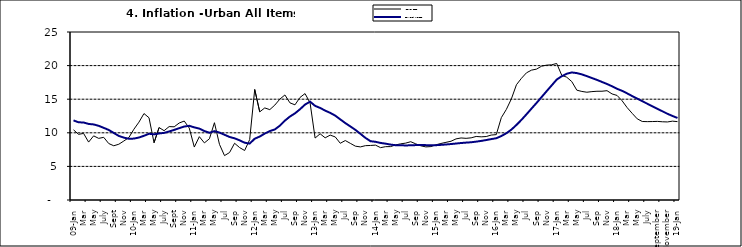
| Category | Year-on Rate | 12-Month Average |
|---|---|---|
| 09-Jan | 10.439 | 11.844 |
| Feb | 9.772 | 11.562 |
| Mar | 9.907 | 11.538 |
| Apr | 8.618 | 11.319 |
| May | 9.547 | 11.246 |
| June | 9.17 | 11.039 |
| July | 9.325 | 10.738 |
| Aug | 8.401 | 10.424 |
| Sept | 8.07 | 9.973 |
| Oct | 8.3 | 9.535 |
| Nov | 8.781 | 9.278 |
| Dec | 9.298 | 9.117 |
| 10-Jan | 10.534 | 9.136 |
| Feb | 11.584 | 9.297 |
| Mar | 12.864 | 9.555 |
| Apr | 12.24 | 9.859 |
| May | 8.524 | 9.769 |
| June | 10.781 | 9.904 |
| July | 10.313 | 9.987 |
| Aug | 10.924 | 10.197 |
| Sept | 10.891 | 10.43 |
| Oct | 11.457 | 10.689 |
| Nov | 11.748 | 10.932 |
| Dec | 10.699 | 11.042 |
| 11-Jan | 7.878 | 10.806 |
| Feb | 9.426 | 10.623 |
| Mar | 8.498 | 10.26 |
| Apr | 9.11 | 10.005 |
| May | 11.5 | 10.249 |
| Jun | 8.278 | 10.034 |
| Jul | 6.608 | 9.711 |
| Aug | 7.061 | 9.38 |
| Sep | 8.443 | 9.178 |
| Oct | 7.802 | 8.88 |
| Nov | 7.365 | 8.525 |
| Dec | 8.993 | 8.395 |
| 12-Jan | 16.445 | 9.119 |
| Feb | 13.123 | 9.443 |
| Mar | 13.701 | 9.889 |
| Apr | 13.447 | 10.259 |
| May | 14.127 | 10.496 |
| Jun | 15.012 | 11.062 |
| Jul | 15.63 | 11.81 |
| Aug | 14.456 | 12.422 |
| Sep | 14.162 | 12.893 |
| Oct | 15.26 | 13.506 |
| Nov | 15.836 | 14.199 |
| Dec | 14.459 | 14.637 |
| 13-Jan | 9.22 | 14.006 |
| Feb | 9.85 | 13.703 |
| Mar | 9.253 | 13.302 |
| Apr | 9.657 | 12.966 |
| May | 9.385 | 12.557 |
| Jun | 8.441 | 11.999 |
| Jul | 8.849 | 11.443 |
| Aug | 8.431 | 10.946 |
| Sep | 8.013 | 10.44 |
| Oct | 7.9 | 9.849 |
| Nov | 8.086 | 9.245 |
| Dec | 8.117 | 8.75 |
| 14-Jan | 8.164 | 8.662 |
| Feb | 7.791 | 8.493 |
| Mar | 7.937 | 8.384 |
| Apr | 7.947 | 8.246 |
| May | 8.195 | 8.151 |
| Jun | 8.358 | 8.146 |
| Jul | 8.464 | 8.118 |
| Aug | 8.673 | 8.141 |
| Sep | 8.357 | 8.17 |
| Oct | 8.064 | 8.182 |
| Nov | 7.902 | 8.165 |
| Dec | 7.948 | 8.151 |
| 15-Jan | 8.211 | 8.155 |
| Feb | 8.412 | 8.206 |
| Mar | 8.579 | 8.26 |
| Apr | 8.742 | 8.326 |
| May | 9.092 | 8.403 |
| Jun | 9.232 | 8.478 |
| Jul | 9.177 | 8.54 |
| Aug | 9.25 | 8.591 |
| Sep | 9.455 | 8.684 |
| Oct | 9.398 | 8.795 |
| Nov | 9.442 | 8.922 |
| Dec | 9.665 | 9.064 |
| 16-Jan | 9.728 | 9.19 |
| Feb | 12.254 | 9.516 |
| Mar | 13.485 | 9.935 |
| Apr | 15.052 | 10.474 |
| May | 17.148 | 11.165 |
| Jun | 18.111 | 11.925 |
| Jul | 18.927 | 12.754 |
| Aug | 19.325 | 13.605 |
| Sep | 19.476 | 14.444 |
| Oct | 19.914 | 15.318 |
| Nov | 20.067 | 16.193 |
| Dec | 20.118 | 17.05 |
| 17-Jan | 20.315 | 17.914 |
| Feb | 18.569 | 18.418 |
| Mar | 18.27 | 18.794 |
| Apr | 17.621 | 18.982 |
| May | 16.343 | 18.883 |
| Jun | 16.153 | 18.692 |
| Jul | 16.038 | 18.43 |
| Aug | 16.128 | 18.151 |
| Sep | 16.183 | 17.872 |
| Oct | 16.187 | 17.567 |
| Nov | 16.267 | 17.264 |
| Dec | 15.785 | 16.921 |
| 18-Jan | 15.559 | 16.55 |
| Feb | 14.763 | 16.241 |
| Mar | 13.748 | 15.866 |
| Apr | 12.893 | 15.468 |
| May | 12.077 | 15.096 |
| June | 11.683 | 14.706 |
| July | 11.661 | 14.329 |
| August | 11.673 | 13.951 |
| September | 11.697 | 13.578 |
| October | 11.64 | 13.206 |
| November | 11.615 | 12.831 |
| December | 11.731 | 12.509 |
| 19-Jan | 11.664 | 12.203 |